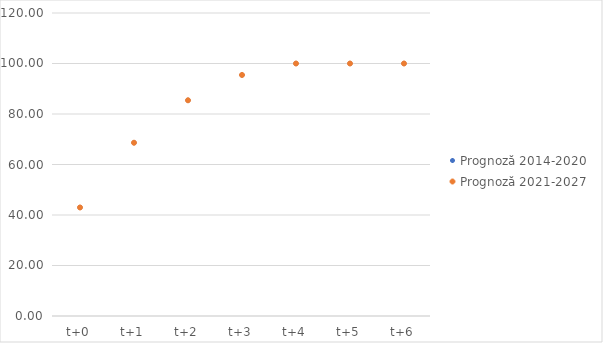
| Category | Prognoză 2014-2020 | Prognoză 2021-2027 |
|---|---|---|
| t+0 | 42.982 | 42.982 |
| t+1 | 68.62 | 68.62 |
| t+2 | 85.432 | 85.432 |
| t+3 | 95.46 | 95.46 |
| t+4 | 100 | 100 |
| t+5 | 100 | 100 |
| t+6 | 100 | 100 |